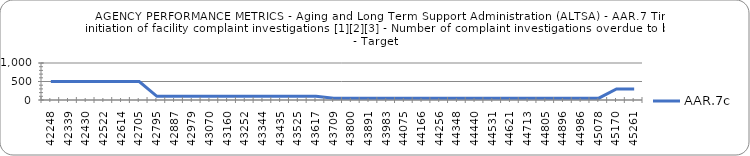
| Category | AAR.7c |
|---|---|
| 2015-09-01 | 500 |
| 2015-12-01 | 500 |
| 2016-03-01 | 500 |
| 2016-06-01 | 500 |
| 2016-09-01 | 500 |
| 2016-12-01 | 500 |
| 2017-03-01 | 100 |
| 2017-06-01 | 100 |
| 2017-09-01 | 100 |
| 2017-12-01 | 100 |
| 2018-03-01 | 100 |
| 2018-06-01 | 100 |
| 2018-09-01 | 100 |
| 2018-12-01 | 100 |
| 2019-03-01 | 100 |
| 2019-06-01 | 100 |
| 2019-09-01 | 50 |
| 2019-12-01 | 50 |
| 2020-03-01 | 50 |
| 2020-06-01 | 50 |
| 2020-09-01 | 50 |
| 2020-12-01 | 50 |
| 2021-03-01 | 50 |
| 2021-06-01 | 50 |
| 2021-09-01 | 50 |
| 2021-12-01 | 50 |
| 2022-03-01 | 50 |
| 2022-06-01 | 50 |
| 2022-09-01 | 50 |
| 2022-12-01 | 50 |
| 2023-03-01 | 50 |
| 2023-06-01 | 50 |
| 2023-09-01 | 300 |
| 2023-12-01 | 300 |